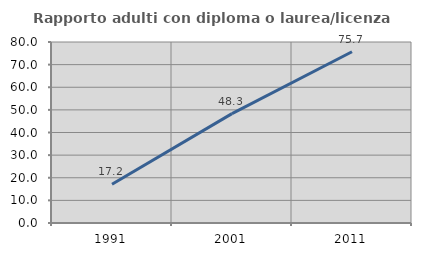
| Category | Rapporto adulti con diploma o laurea/licenza media  |
|---|---|
| 1991.0 | 17.16 |
| 2001.0 | 48.347 |
| 2011.0 | 75.685 |